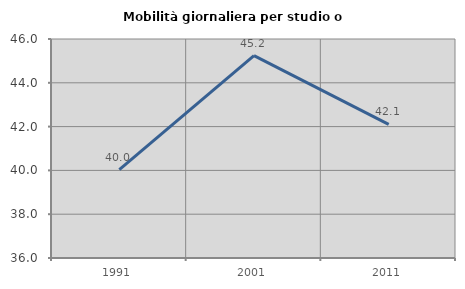
| Category | Mobilità giornaliera per studio o lavoro |
|---|---|
| 1991.0 | 40.037 |
| 2001.0 | 45.24 |
| 2011.0 | 42.105 |